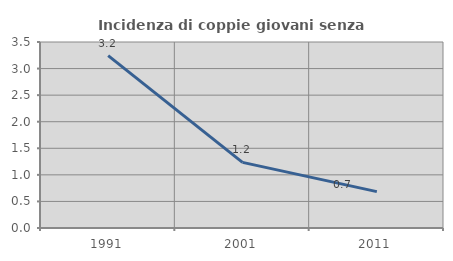
| Category | Incidenza di coppie giovani senza figli |
|---|---|
| 1991.0 | 3.243 |
| 2001.0 | 1.235 |
| 2011.0 | 0.685 |